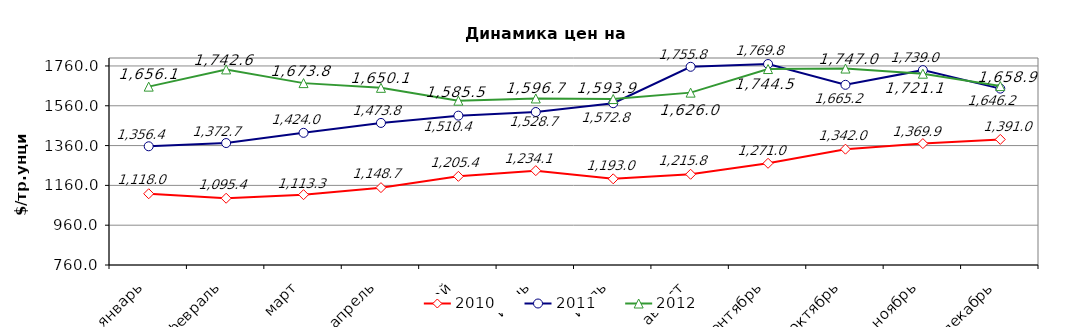
| Category | 2010 | 2011 | 2012 |
|---|---|---|---|
| январь | 1117.962 | 1356.4 | 1656.12 |
| февраль | 1095.412 | 1372.73 | 1742.62 |
| март | 1113.34 | 1424.01 | 1673.77 |
| апрель | 1148.69 | 1473.81 | 1650.07 |
| май | 1205.43 | 1510.44 | 1585.5 |
| июнь | 1234.075 | 1528.66 | 1596.7 |
| июль | 1192.97 | 1572.81 | 1593.9 |
| август | 1215.81 | 1755.81 | 1626 |
| сентябрь | 1270.98 | 1769.76 | 1744.5 |
| октябрь | 1342 | 1665.214 | 1747.01 |
| ноябрь | 1369.89 | 1738.98 | 1721.13 |
| декабрь | 1391.01 | 1646.2 | 1658.87 |